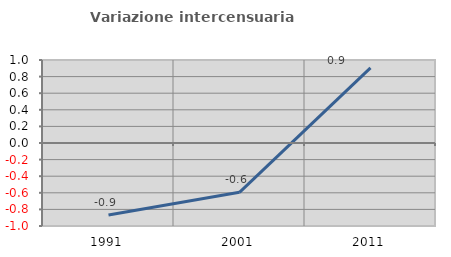
| Category | Variazione intercensuaria annua |
|---|---|
| 1991.0 | -0.867 |
| 2001.0 | -0.594 |
| 2011.0 | 0.905 |